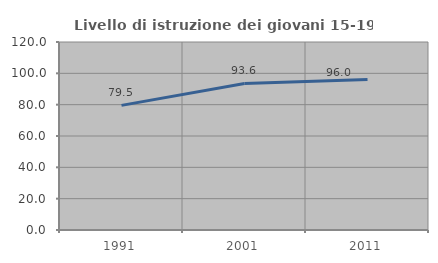
| Category | Livello di istruzione dei giovani 15-19 anni |
|---|---|
| 1991.0 | 79.545 |
| 2001.0 | 93.561 |
| 2011.0 | 96.035 |